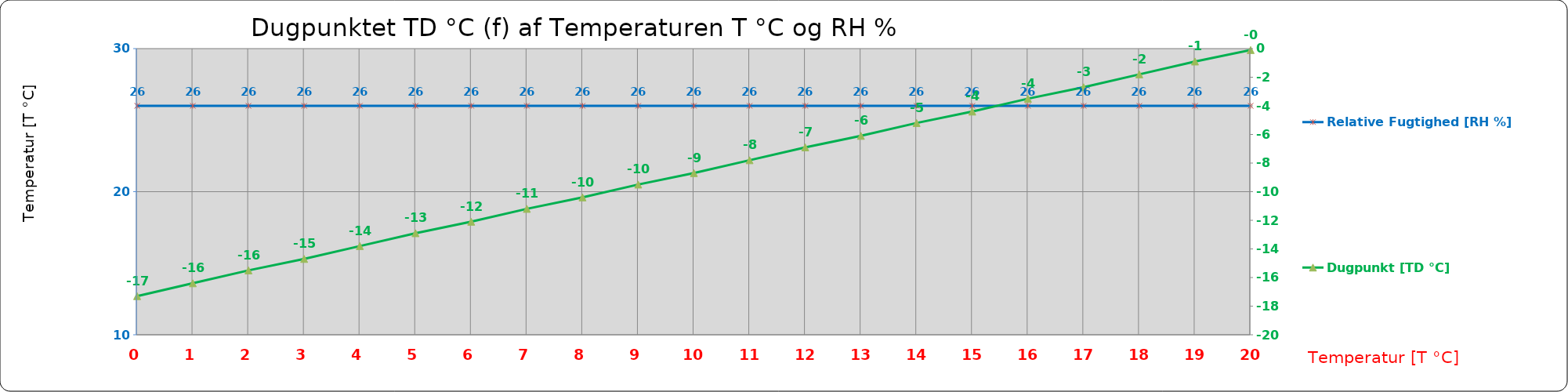
| Category | Relative Fugtighed [RH %]                 |
|---|---|
| 0.0 | 26 |
| 1.0 | 26 |
| 2.0 | 26 |
| 3.0 | 26 |
| 4.0 | 26 |
| 5.0 | 26 |
| 6.0 | 26 |
| 7.0 | 26 |
| 8.0 | 26 |
| 9.0 | 26 |
| 10.0 | 26 |
| 11.0 | 26 |
| 12.0 | 26 |
| 13.0 | 26 |
| 14.0 | 26 |
| 15.0 | 26 |
| 16.0 | 26 |
| 17.0 | 26 |
| 18.0 | 26 |
| 19.0 | 26 |
| 20.0 | 26 |